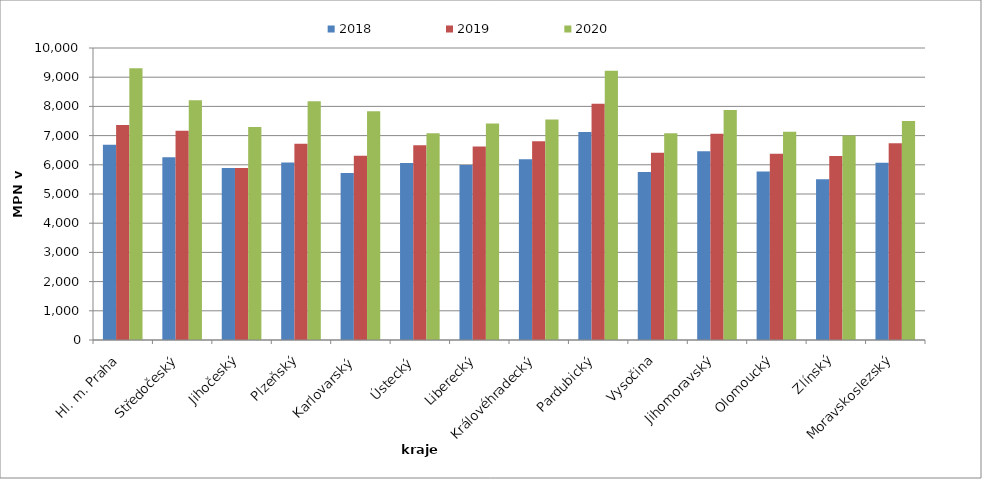
| Category | 2018 | 2019 | 2020 |
|---|---|---|---|
| Hl. m. Praha | 6683 | 7367 | 9305 |
| Středočeský | 6260 | 7165 | 8207 |
| Jihočeský | 5893 | 5893 | 7298 |
| Plzeňský | 6076 | 6724 | 8179 |
| Karlovarský  | 5717 | 6306 | 7831 |
| Ústecký   | 6063 | 6669 | 7080 |
| Liberecký | 5993 | 6629 | 7411 |
| Královéhradecký | 6187 | 6805 | 7554 |
| Pardubický | 7122 | 8087 | 9218 |
| Vysočina | 5752 | 6414 | 7077 |
| Jihomoravský | 6467 | 7063 | 7876 |
| Olomoucký | 5769 | 6375 | 7128 |
| Zlínský | 5504 | 6299 | 7006 |
| Moravskoslezský | 6066 | 6735 | 7504 |